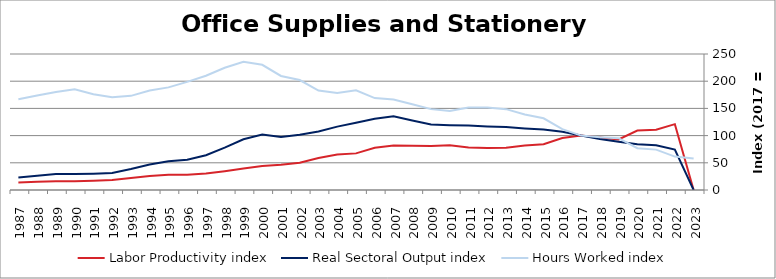
| Category | Labor Productivity index | Real Sectoral Output index | Hours Worked index |
|---|---|---|---|
| 2023.0 | 0 | 0 | 57.697 |
| 2022.0 | 121.026 | 74.279 | 61.374 |
| 2021.0 | 110.67 | 82.144 | 74.224 |
| 2020.0 | 109.396 | 83.991 | 76.777 |
| 2019.0 | 93.042 | 88.71 | 95.344 |
| 2018.0 | 96.636 | 93.829 | 97.096 |
| 2017.0 | 100 | 100 | 100 |
| 2016.0 | 95.673 | 106.964 | 111.802 |
| 2015.0 | 84.262 | 111.106 | 131.858 |
| 2014.0 | 81.616 | 113.268 | 138.782 |
| 2013.0 | 77.821 | 115.664 | 148.629 |
| 2012.0 | 77.156 | 116.894 | 151.502 |
| 2011.0 | 78.177 | 118.453 | 151.519 |
| 2010.0 | 82.067 | 119.253 | 145.311 |
| 2009.0 | 80.916 | 120.282 | 148.651 |
| 2008.0 | 81.128 | 127.924 | 157.682 |
| 2007.0 | 81.603 | 135.727 | 166.327 |
| 2006.0 | 77.549 | 131.076 | 169.024 |
| 2005.0 | 67.325 | 123.486 | 183.416 |
| 2004.0 | 65.356 | 116.473 | 178.214 |
| 2003.0 | 58.882 | 107.579 | 182.704 |
| 2002.0 | 50.289 | 101.636 | 202.103 |
| 2001.0 | 46.546 | 97.56 | 209.599 |
| 2000.0 | 44.227 | 101.808 | 230.193 |
| 1999.0 | 39.538 | 93.211 | 235.752 |
| 1998.0 | 34.62 | 77.809 | 224.754 |
| 1997.0 | 30.451 | 63.933 | 209.953 |
| 1996.0 | 28.013 | 55.66 | 198.698 |
| 1995.0 | 27.945 | 52.723 | 188.664 |
| 1994.0 | 25.602 | 46.81 | 182.832 |
| 1993.0 | 22.238 | 38.49 | 173.083 |
| 1992.0 | 18.279 | 31.188 | 170.624 |
| 1991.0 | 17.1 | 30.082 | 175.918 |
| 1990.0 | 15.949 | 29.559 | 185.338 |
| 1989.0 | 16.245 | 29.294 | 180.326 |
| 1988.0 | 14.949 | 25.995 | 173.894 |
| 1987.0 | 13.741 | 22.899 | 166.65 |